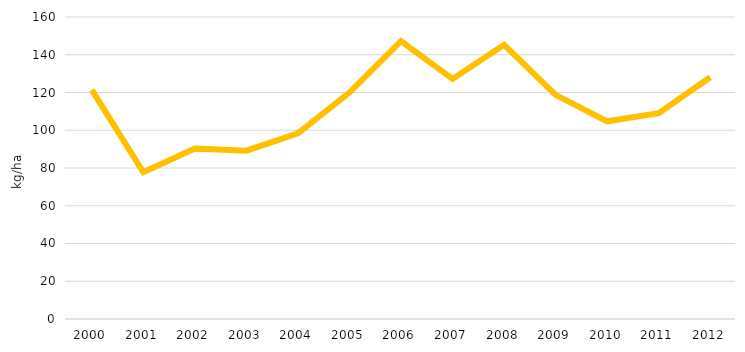
| Category | Вкупно употребени минерални  ѓубрива на обработлива површина (kg/ha) 
(земјоделски претпријатија и земјоделски задруги) |
|---|---|
| 2000.0 | 121.432 |
| 2001.0 | 77.744 |
| 2002.0 | 90.338 |
| 2003.0 | 89.167 |
| 2004.0 | 98.323 |
| 2005.0 | 119.99 |
| 2006.0 | 147.236 |
| 2007.0 | 127.169 |
| 2008.0 | 145.244 |
| 2009.0 | 118.765 |
| 2010.0 | 104.741 |
| 2011.0 | 109.003 |
| 2012.0 | 128.076 |